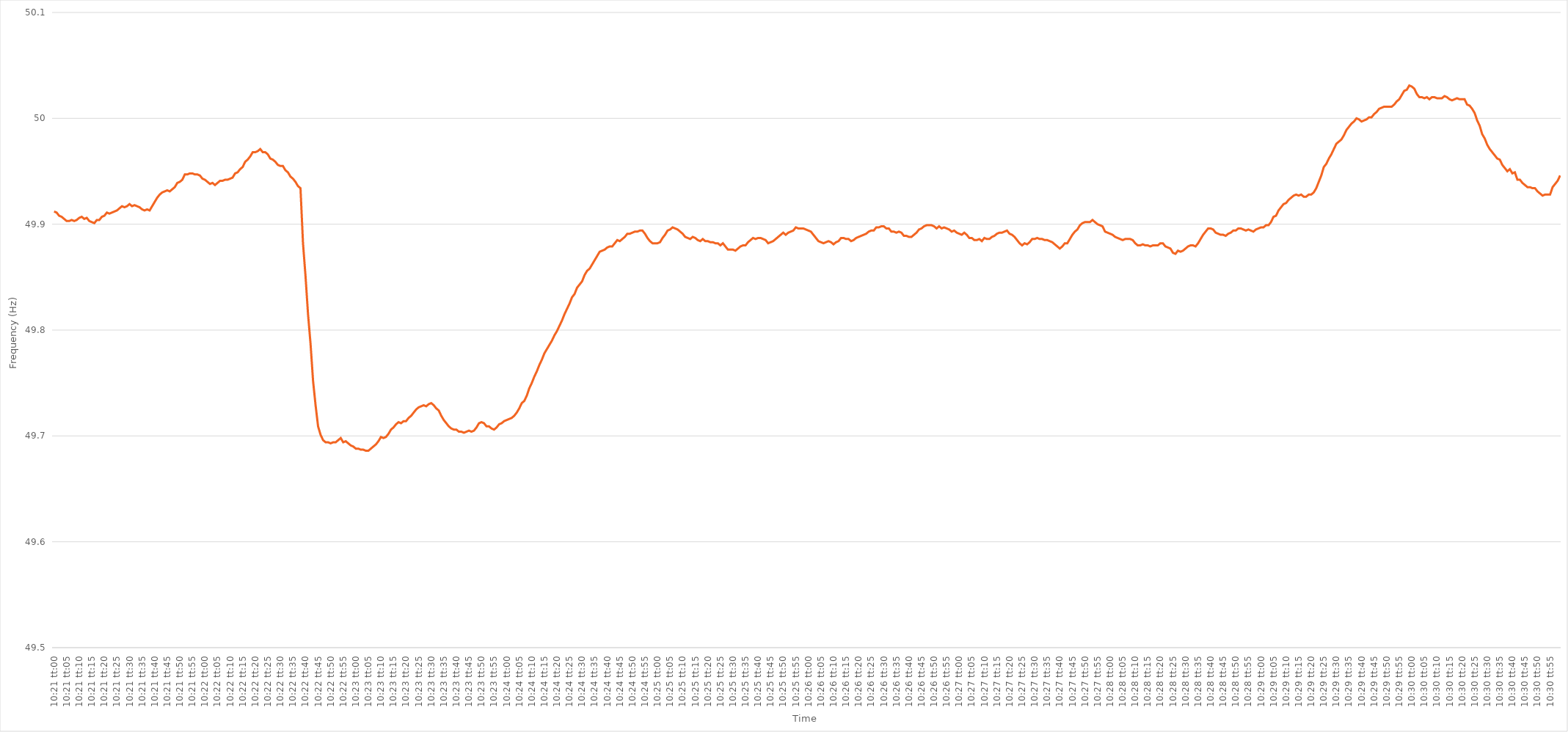
| Category | Series 0 |
|---|---|
| 0.43124999999999997 | 49.912 |
| 0.4312615740740741 | 49.911 |
| 0.43127314814814816 | 49.908 |
| 0.43128472222222225 | 49.907 |
| 0.4312962962962963 | 49.905 |
| 0.4313078703703704 | 49.903 |
| 0.4313194444444444 | 49.903 |
| 0.43133101851851857 | 49.904 |
| 0.4313425925925926 | 49.903 |
| 0.43135416666666665 | 49.904 |
| 0.43136574074074074 | 49.906 |
| 0.4313773148148148 | 49.907 |
| 0.4313888888888889 | 49.905 |
| 0.4314004629629629 | 49.906 |
| 0.43141203703703707 | 49.903 |
| 0.4314236111111111 | 49.902 |
| 0.4314351851851852 | 49.901 |
| 0.43144675925925924 | 49.904 |
| 0.43145833333333333 | 49.904 |
| 0.43146990740740737 | 49.907 |
| 0.4314814814814815 | 49.908 |
| 0.43149305555555556 | 49.911 |
| 0.43150462962962965 | 49.91 |
| 0.4315162037037037 | 49.911 |
| 0.4315277777777778 | 49.912 |
| 0.4315393518518518 | 49.913 |
| 0.431550925925926 | 49.915 |
| 0.4315625 | 49.917 |
| 0.43157407407407405 | 49.916 |
| 0.43158564814814815 | 49.917 |
| 0.4315972222222222 | 49.919 |
| 0.4316087962962963 | 49.917 |
| 0.4316203703703703 | 49.918 |
| 0.43163194444444447 | 49.917 |
| 0.4316435185185185 | 49.916 |
| 0.4316550925925926 | 49.914 |
| 0.43166666666666664 | 49.913 |
| 0.43167824074074074 | 49.914 |
| 0.4316898148148148 | 49.913 |
| 0.4317013888888889 | 49.917 |
| 0.43171296296296297 | 49.921 |
| 0.43172453703703706 | 49.925 |
| 0.4317361111111111 | 49.928 |
| 0.4317476851851852 | 49.93 |
| 0.43175925925925923 | 49.931 |
| 0.4317708333333334 | 49.932 |
| 0.4317824074074074 | 49.931 |
| 0.4317939814814815 | 49.933 |
| 0.43180555555555555 | 49.935 |
| 0.43181712962962965 | 49.939 |
| 0.4318287037037037 | 49.94 |
| 0.4318402777777777 | 49.942 |
| 0.4318518518518519 | 49.947 |
| 0.4318634259259259 | 49.947 |
| 0.431875 | 49.948 |
| 0.43188657407407405 | 49.948 |
| 0.43189814814814814 | 49.947 |
| 0.4319097222222222 | 49.947 |
| 0.43192129629629633 | 49.946 |
| 0.43193287037037037 | 49.943 |
| 0.43194444444444446 | 49.942 |
| 0.4319560185185185 | 49.94 |
| 0.4319675925925926 | 49.938 |
| 0.43197916666666664 | 49.939 |
| 0.4319907407407408 | 49.937 |
| 0.4320023148148148 | 49.939 |
| 0.4320138888888889 | 49.941 |
| 0.43202546296296296 | 49.941 |
| 0.43203703703703705 | 49.942 |
| 0.4320486111111111 | 49.942 |
| 0.43206018518518513 | 49.943 |
| 0.4320717592592593 | 49.944 |
| 0.4320833333333333 | 49.948 |
| 0.4320949074074074 | 49.949 |
| 0.43210648148148145 | 49.952 |
| 0.43211805555555555 | 49.954 |
| 0.4321296296296296 | 49.959 |
| 0.43214120370370374 | 49.961 |
| 0.4321527777777778 | 49.964 |
| 0.43216435185185187 | 49.968 |
| 0.4321759259259259 | 49.968 |
| 0.4321875 | 49.969 |
| 0.43219907407407404 | 49.971 |
| 0.4322106481481482 | 49.968 |
| 0.43222222222222223 | 49.968 |
| 0.4322337962962963 | 49.966 |
| 0.43224537037037036 | 49.962 |
| 0.43225694444444446 | 49.961 |
| 0.4322685185185185 | 49.959 |
| 0.43228009259259265 | 49.956 |
| 0.4322916666666667 | 49.955 |
| 0.4323032407407407 | 49.955 |
| 0.4323148148148148 | 49.951 |
| 0.43232638888888886 | 49.949 |
| 0.43233796296296295 | 49.945 |
| 0.432349537037037 | 49.943 |
| 0.43236111111111114 | 49.94 |
| 0.4323726851851852 | 49.936 |
| 0.4323842592592593 | 49.934 |
| 0.4323958333333333 | 49.882 |
| 0.4324074074074074 | 49.851 |
| 0.43241898148148145 | 49.815 |
| 0.4324305555555556 | 49.787 |
| 0.43244212962962963 | 49.752 |
| 0.43245370370370373 | 49.729 |
| 0.43246527777777777 | 49.709 |
| 0.43247685185185186 | 49.701 |
| 0.4324884259259259 | 49.696 |
| 0.43250000000000005 | 49.694 |
| 0.4325115740740741 | 49.694 |
| 0.4325231481481482 | 49.693 |
| 0.4325347222222222 | 49.694 |
| 0.43254629629629626 | 49.694 |
| 0.43255787037037036 | 49.696 |
| 0.4325694444444444 | 49.698 |
| 0.43258101851851855 | 49.694 |
| 0.4325925925925926 | 49.695 |
| 0.4326041666666667 | 49.693 |
| 0.4326157407407407 | 49.691 |
| 0.4326273148148148 | 49.69 |
| 0.43263888888888885 | 49.688 |
| 0.432650462962963 | 49.688 |
| 0.43266203703703704 | 49.687 |
| 0.43267361111111113 | 49.687 |
| 0.4326851851851852 | 49.686 |
| 0.43269675925925927 | 49.686 |
| 0.4327083333333333 | 49.688 |
| 0.43271990740740746 | 49.69 |
| 0.4327314814814815 | 49.692 |
| 0.4327430555555556 | 49.695 |
| 0.43275462962962963 | 49.699 |
| 0.43276620370370367 | 49.698 |
| 0.43277777777777776 | 49.699 |
| 0.4327893518518518 | 49.702 |
| 0.43280092592592595 | 49.706 |
| 0.4328125 | 49.708 |
| 0.4328240740740741 | 49.711 |
| 0.4328356481481481 | 49.713 |
| 0.4328472222222222 | 49.712 |
| 0.43285879629629626 | 49.714 |
| 0.4328703703703704 | 49.714 |
| 0.43288194444444444 | 49.717 |
| 0.43289351851851854 | 49.719 |
| 0.4329050925925926 | 49.722 |
| 0.43291666666666667 | 49.725 |
| 0.4329282407407407 | 49.727 |
| 0.43293981481481486 | 49.728 |
| 0.4329513888888889 | 49.729 |
| 0.432962962962963 | 49.728 |
| 0.43297453703703703 | 49.73 |
| 0.4329861111111111 | 49.731 |
| 0.43299768518518517 | 49.729 |
| 0.4330092592592593 | 49.726 |
| 0.43302083333333335 | 49.724 |
| 0.4330324074074074 | 49.719 |
| 0.4330439814814815 | 49.715 |
| 0.4330555555555555 | 49.712 |
| 0.4330671296296296 | 49.709 |
| 0.43307870370370366 | 49.707 |
| 0.4330902777777778 | 49.706 |
| 0.43310185185185185 | 49.706 |
| 0.43311342592592594 | 49.704 |
| 0.433125 | 49.704 |
| 0.4331365740740741 | 49.703 |
| 0.4331481481481481 | 49.704 |
| 0.43315972222222227 | 49.705 |
| 0.4331712962962963 | 49.704 |
| 0.4331828703703704 | 49.705 |
| 0.43319444444444444 | 49.708 |
| 0.43320601851851853 | 49.712 |
| 0.43321759259259257 | 49.713 |
| 0.4332291666666667 | 49.712 |
| 0.43324074074074076 | 49.709 |
| 0.4332523148148148 | 49.709 |
| 0.4332638888888889 | 49.707 |
| 0.43327546296296293 | 49.706 |
| 0.433287037037037 | 49.708 |
| 0.43329861111111106 | 49.711 |
| 0.4333101851851852 | 49.712 |
| 0.43332175925925925 | 49.714 |
| 0.43333333333333335 | 49.715 |
| 0.4333449074074074 | 49.716 |
| 0.4333564814814815 | 49.717 |
| 0.4333680555555555 | 49.719 |
| 0.43337962962962967 | 49.722 |
| 0.4333912037037037 | 49.726 |
| 0.4334027777777778 | 49.731 |
| 0.43341435185185184 | 49.733 |
| 0.43342592592592594 | 49.738 |
| 0.4334375 | 49.745 |
| 0.4334490740740741 | 49.75 |
| 0.43346064814814816 | 49.756 |
| 0.4334722222222222 | 49.761 |
| 0.4334837962962963 | 49.767 |
| 0.43349537037037034 | 49.772 |
| 0.43350694444444443 | 49.778 |
| 0.43351851851851847 | 49.782 |
| 0.4335300925925926 | 49.786 |
| 0.43354166666666666 | 49.79 |
| 0.43355324074074075 | 49.795 |
| 0.4335648148148148 | 49.799 |
| 0.4335763888888889 | 49.804 |
| 0.4335879629629629 | 49.809 |
| 0.4335995370370371 | 49.815 |
| 0.4336111111111111 | 49.82 |
| 0.4336226851851852 | 49.825 |
| 0.43363425925925925 | 49.831 |
| 0.43364583333333334 | 49.834 |
| 0.4336574074074074 | 49.84 |
| 0.43366898148148153 | 49.843 |
| 0.43368055555555557 | 49.846 |
| 0.43369212962962966 | 49.852 |
| 0.4337037037037037 | 49.856 |
| 0.4337152777777778 | 49.858 |
| 0.43372685185185184 | 49.862 |
| 0.4337384259259259 | 49.866 |
| 0.43375 | 49.87 |
| 0.43376157407407406 | 49.874 |
| 0.43377314814814816 | 49.875 |
| 0.4337847222222222 | 49.876 |
| 0.4337962962962963 | 49.878 |
| 0.43380787037037033 | 49.879 |
| 0.4338194444444445 | 49.879 |
| 0.4338310185185185 | 49.882 |
| 0.4338425925925926 | 49.885 |
| 0.43385416666666665 | 49.884 |
| 0.43386574074074075 | 49.886 |
| 0.4338773148148148 | 49.888 |
| 0.43388888888888894 | 49.891 |
| 0.433900462962963 | 49.891 |
| 0.43391203703703707 | 49.892 |
| 0.4339236111111111 | 49.893 |
| 0.4339351851851852 | 49.893 |
| 0.43394675925925924 | 49.894 |
| 0.4339583333333333 | 49.894 |
| 0.43396990740740743 | 49.891 |
| 0.43398148148148147 | 49.887 |
| 0.43399305555555556 | 49.884 |
| 0.4340046296296296 | 49.882 |
| 0.4340162037037037 | 49.882 |
| 0.43402777777777773 | 49.882 |
| 0.4340393518518519 | 49.883 |
| 0.4340509259259259 | 49.887 |
| 0.4340625 | 49.89 |
| 0.43407407407407406 | 49.894 |
| 0.43408564814814815 | 49.895 |
| 0.4340972222222222 | 49.897 |
| 0.43410879629629634 | 49.896 |
| 0.4341203703703704 | 49.895 |
| 0.4341319444444445 | 49.893 |
| 0.4341435185185185 | 49.891 |
| 0.4341550925925926 | 49.888 |
| 0.43416666666666665 | 49.887 |
| 0.4341782407407407 | 49.886 |
| 0.43418981481481483 | 49.888 |
| 0.4342013888888889 | 49.887 |
| 0.43421296296296297 | 49.885 |
| 0.434224537037037 | 49.884 |
| 0.4342361111111111 | 49.886 |
| 0.43424768518518514 | 49.884 |
| 0.4342592592592593 | 49.884 |
| 0.43427083333333333 | 49.883 |
| 0.4342824074074074 | 49.883 |
| 0.43429398148148146 | 49.882 |
| 0.43430555555555556 | 49.882 |
| 0.4343171296296296 | 49.88 |
| 0.43432870370370374 | 49.882 |
| 0.4343402777777778 | 49.879 |
| 0.4343518518518519 | 49.876 |
| 0.4343634259259259 | 49.876 |
| 0.434375 | 49.876 |
| 0.43438657407407405 | 49.875 |
| 0.4343981481481482 | 49.877 |
| 0.43440972222222224 | 49.879 |
| 0.43442129629629633 | 49.88 |
| 0.43443287037037037 | 49.88 |
| 0.4344444444444444 | 49.883 |
| 0.4344560185185185 | 49.885 |
| 0.43446759259259254 | 49.887 |
| 0.4344791666666667 | 49.886 |
| 0.43449074074074073 | 49.887 |
| 0.4345023148148148 | 49.887 |
| 0.43451388888888887 | 49.886 |
| 0.43452546296296296 | 49.885 |
| 0.434537037037037 | 49.882 |
| 0.43454861111111115 | 49.883 |
| 0.4345601851851852 | 49.884 |
| 0.4345717592592593 | 49.886 |
| 0.4345833333333333 | 49.888 |
| 0.4345949074074074 | 49.89 |
| 0.43460648148148145 | 49.892 |
| 0.4346180555555556 | 49.89 |
| 0.43462962962962964 | 49.892 |
| 0.43464120370370374 | 49.893 |
| 0.4346527777777778 | 49.894 |
| 0.4346643518518518 | 49.897 |
| 0.4346759259259259 | 49.896 |
| 0.43468749999999995 | 49.896 |
| 0.4346990740740741 | 49.896 |
| 0.43471064814814814 | 49.895 |
| 0.43472222222222223 | 49.894 |
| 0.43473379629629627 | 49.893 |
| 0.43474537037037037 | 49.89 |
| 0.4347569444444444 | 49.887 |
| 0.43476851851851855 | 49.884 |
| 0.4347800925925926 | 49.883 |
| 0.4347916666666667 | 49.882 |
| 0.4348032407407407 | 49.883 |
| 0.4348148148148148 | 49.884 |
| 0.43482638888888886 | 49.883 |
| 0.434837962962963 | 49.881 |
| 0.43484953703703705 | 49.883 |
| 0.43486111111111114 | 49.884 |
| 0.4348726851851852 | 49.887 |
| 0.4348842592592593 | 49.887 |
| 0.4348958333333333 | 49.886 |
| 0.43490740740740735 | 49.886 |
| 0.4349189814814815 | 49.884 |
| 0.43493055555555554 | 49.885 |
| 0.43494212962962964 | 49.887 |
| 0.4349537037037037 | 49.888 |
| 0.43496527777777777 | 49.889 |
| 0.4349768518518518 | 49.89 |
| 0.43498842592592596 | 49.891 |
| 0.435 | 49.893 |
| 0.4350115740740741 | 49.894 |
| 0.43502314814814813 | 49.894 |
| 0.4350347222222222 | 49.897 |
| 0.43504629629629626 | 49.897 |
| 0.4350578703703704 | 49.898 |
| 0.43506944444444445 | 49.898 |
| 0.43508101851851855 | 49.896 |
| 0.4350925925925926 | 49.896 |
| 0.4351041666666667 | 49.893 |
| 0.4351157407407407 | 49.893 |
| 0.43512731481481487 | 49.892 |
| 0.4351388888888889 | 49.893 |
| 0.43515046296296295 | 49.892 |
| 0.43516203703703704 | 49.889 |
| 0.4351736111111111 | 49.889 |
| 0.4351851851851852 | 49.888 |
| 0.4351967592592592 | 49.888 |
| 0.43520833333333336 | 49.89 |
| 0.4352199074074074 | 49.892 |
| 0.4352314814814815 | 49.895 |
| 0.43524305555555554 | 49.896 |
| 0.43525462962962963 | 49.898 |
| 0.43526620370370367 | 49.899 |
| 0.4352777777777778 | 49.899 |
| 0.43528935185185186 | 49.899 |
| 0.43530092592592595 | 49.898 |
| 0.4353125 | 49.896 |
| 0.4353240740740741 | 49.898 |
| 0.4353356481481481 | 49.896 |
| 0.4353472222222223 | 49.897 |
| 0.4353587962962963 | 49.896 |
| 0.43537037037037035 | 49.895 |
| 0.43538194444444445 | 49.893 |
| 0.4353935185185185 | 49.894 |
| 0.4354050925925926 | 49.892 |
| 0.4354166666666666 | 49.891 |
| 0.43542824074074077 | 49.89 |
| 0.4354398148148148 | 49.892 |
| 0.4354513888888889 | 49.89 |
| 0.43546296296296294 | 49.887 |
| 0.43547453703703703 | 49.887 |
| 0.4354861111111111 | 49.885 |
| 0.4354976851851852 | 49.885 |
| 0.43550925925925926 | 49.886 |
| 0.43552083333333336 | 49.884 |
| 0.4355324074074074 | 49.887 |
| 0.4355439814814815 | 49.886 |
| 0.43555555555555553 | 49.886 |
| 0.4355671296296297 | 49.888 |
| 0.4355787037037037 | 49.889 |
| 0.4355902777777778 | 49.891 |
| 0.43560185185185185 | 49.892 |
| 0.43561342592592595 | 49.892 |
| 0.435625 | 49.893 |
| 0.435636574074074 | 49.894 |
| 0.4356481481481482 | 49.891 |
| 0.4356597222222222 | 49.89 |
| 0.4356712962962963 | 49.888 |
| 0.43568287037037035 | 49.885 |
| 0.43569444444444444 | 49.882 |
| 0.4357060185185185 | 49.88 |
| 0.43571759259259263 | 49.882 |
| 0.43572916666666667 | 49.881 |
| 0.43574074074074076 | 49.883 |
| 0.4357523148148148 | 49.886 |
| 0.4357638888888889 | 49.886 |
| 0.43577546296296293 | 49.887 |
| 0.4357870370370371 | 49.886 |
| 0.4357986111111111 | 49.886 |
| 0.4358101851851852 | 49.885 |
| 0.43582175925925926 | 49.885 |
| 0.43583333333333335 | 49.884 |
| 0.4358449074074074 | 49.883 |
| 0.43585648148148143 | 49.881 |
| 0.4358680555555556 | 49.879 |
| 0.4358796296296296 | 49.877 |
| 0.4358912037037037 | 49.879 |
| 0.43590277777777775 | 49.882 |
| 0.43591435185185184 | 49.882 |
| 0.4359259259259259 | 49.886 |
| 0.43593750000000003 | 49.89 |
| 0.43594907407407407 | 49.893 |
| 0.43596064814814817 | 49.895 |
| 0.4359722222222222 | 49.899 |
| 0.4359837962962963 | 49.901 |
| 0.43599537037037034 | 49.902 |
| 0.4360069444444445 | 49.902 |
| 0.4360185185185185 | 49.902 |
| 0.4360300925925926 | 49.904 |
| 0.43604166666666666 | 49.902 |
| 0.43605324074074076 | 49.9 |
| 0.4360648148148148 | 49.899 |
| 0.43607638888888883 | 49.898 |
| 0.436087962962963 | 49.893 |
| 0.436099537037037 | 49.892 |
| 0.4361111111111111 | 49.891 |
| 0.43612268518518515 | 49.89 |
| 0.43613425925925925 | 49.888 |
| 0.4361458333333333 | 49.887 |
| 0.43615740740740744 | 49.886 |
| 0.4361689814814815 | 49.885 |
| 0.43618055555555557 | 49.886 |
| 0.4361921296296296 | 49.886 |
| 0.4362037037037037 | 49.886 |
| 0.43621527777777774 | 49.885 |
| 0.4362268518518519 | 49.882 |
| 0.43623842592592593 | 49.88 |
| 0.43625 | 49.88 |
| 0.43626157407407407 | 49.881 |
| 0.43627314814814816 | 49.88 |
| 0.4362847222222222 | 49.88 |
| 0.43629629629629635 | 49.879 |
| 0.4363078703703704 | 49.88 |
| 0.4363194444444445 | 49.88 |
| 0.4363310185185185 | 49.88 |
| 0.43634259259259256 | 49.882 |
| 0.43635416666666665 | 49.882 |
| 0.4363657407407407 | 49.879 |
| 0.43637731481481484 | 49.878 |
| 0.4363888888888889 | 49.877 |
| 0.436400462962963 | 49.873 |
| 0.436412037037037 | 49.872 |
| 0.4364236111111111 | 49.875 |
| 0.43643518518518515 | 49.874 |
| 0.4364467592592593 | 49.875 |
| 0.43645833333333334 | 49.877 |
| 0.43646990740740743 | 49.879 |
| 0.43648148148148147 | 49.88 |
| 0.43649305555555556 | 49.88 |
| 0.4365046296296296 | 49.879 |
| 0.43651620370370375 | 49.882 |
| 0.4365277777777778 | 49.886 |
| 0.4365393518518519 | 49.89 |
| 0.4365509259259259 | 49.893 |
| 0.43656249999999996 | 49.896 |
| 0.43657407407407406 | 49.896 |
| 0.4365856481481481 | 49.895 |
| 0.43659722222222225 | 49.892 |
| 0.4366087962962963 | 49.891 |
| 0.4366203703703704 | 49.89 |
| 0.4366319444444444 | 49.89 |
| 0.4366435185185185 | 49.889 |
| 0.43665509259259255 | 49.891 |
| 0.4366666666666667 | 49.892 |
| 0.43667824074074074 | 49.894 |
| 0.43668981481481484 | 49.894 |
| 0.4367013888888889 | 49.896 |
| 0.43671296296296297 | 49.896 |
| 0.436724537037037 | 49.895 |
| 0.43673611111111116 | 49.894 |
| 0.4367476851851852 | 49.895 |
| 0.4367592592592593 | 49.894 |
| 0.43677083333333333 | 49.893 |
| 0.43678240740740737 | 49.895 |
| 0.43679398148148146 | 49.896 |
| 0.4368055555555555 | 49.897 |
| 0.43681712962962965 | 49.897 |
| 0.4368287037037037 | 49.899 |
| 0.4368402777777778 | 49.899 |
| 0.4368518518518518 | 49.902 |
| 0.4368634259259259 | 49.907 |
| 0.43687499999999996 | 49.908 |
| 0.4368865740740741 | 49.913 |
| 0.43689814814814815 | 49.916 |
| 0.43690972222222224 | 49.919 |
| 0.4369212962962963 | 49.92 |
| 0.4369328703703704 | 49.923 |
| 0.4369444444444444 | 49.925 |
| 0.43695601851851856 | 49.927 |
| 0.4369675925925926 | 49.928 |
| 0.4369791666666667 | 49.927 |
| 0.43699074074074074 | 49.928 |
| 0.43700231481481483 | 49.926 |
| 0.43701388888888887 | 49.926 |
| 0.437025462962963 | 49.928 |
| 0.43703703703703706 | 49.928 |
| 0.4370486111111111 | 49.93 |
| 0.4370601851851852 | 49.934 |
| 0.43707175925925923 | 49.94 |
| 0.4370833333333333 | 49.946 |
| 0.43709490740740736 | 49.954 |
| 0.4371064814814815 | 49.957 |
| 0.43711805555555555 | 49.962 |
| 0.43712962962962965 | 49.966 |
| 0.4371412037037037 | 49.971 |
| 0.4371527777777778 | 49.976 |
| 0.4371643518518518 | 49.978 |
| 0.43717592592592597 | 49.98 |
| 0.4371875 | 49.984 |
| 0.4371990740740741 | 49.989 |
| 0.43721064814814814 | 49.992 |
| 0.43722222222222223 | 49.995 |
| 0.4372337962962963 | 49.997 |
| 0.4372453703703704 | 50 |
| 0.43725694444444446 | 49.999 |
| 0.4372685185185185 | 49.997 |
| 0.4372800925925926 | 49.998 |
| 0.43729166666666663 | 49.999 |
| 0.43730324074074073 | 50.001 |
| 0.43731481481481477 | 50.001 |
| 0.4373263888888889 | 50.004 |
| 0.43733796296296296 | 50.006 |
| 0.43734953703703705 | 50.009 |
| 0.4373611111111111 | 50.01 |
| 0.4373726851851852 | 50.011 |
| 0.4373842592592592 | 50.011 |
| 0.4373958333333334 | 50.011 |
| 0.4374074074074074 | 50.011 |
| 0.4374189814814815 | 50.013 |
| 0.43743055555555554 | 50.016 |
| 0.43744212962962964 | 50.018 |
| 0.4374537037037037 | 50.022 |
| 0.43746527777777783 | 50.026 |
| 0.43747685185185187 | 50.027 |
| 0.43748842592592596 | 50.031 |
| 0.4375 | 50.03 |
| 0.43751157407407404 | 50.028 |
| 0.43752314814814813 | 50.023 |
| 0.43753472222222217 | 50.02 |
| 0.4375462962962963 | 50.02 |
| 0.43755787037037036 | 50.019 |
| 0.43756944444444446 | 50.02 |
| 0.4375810185185185 | 50.018 |
| 0.4375925925925926 | 50.02 |
| 0.4376041666666666 | 50.02 |
| 0.4376157407407408 | 50.019 |
| 0.4376273148148148 | 50.019 |
| 0.4376388888888889 | 50.019 |
| 0.43765046296296295 | 50.021 |
| 0.43766203703703704 | 50.02 |
| 0.4376736111111111 | 50.018 |
| 0.43768518518518523 | 50.017 |
| 0.43769675925925927 | 50.018 |
| 0.43770833333333337 | 50.019 |
| 0.4377199074074074 | 50.018 |
| 0.4377314814814815 | 50.018 |
| 0.43774305555555554 | 50.018 |
| 0.4377546296296296 | 50.013 |
| 0.4377662037037037 | 50.012 |
| 0.43777777777777777 | 50.009 |
| 0.43778935185185186 | 50.005 |
| 0.4378009259259259 | 49.998 |
| 0.4378125 | 49.993 |
| 0.43782407407407403 | 49.985 |
| 0.4378356481481482 | 49.981 |
| 0.4378472222222222 | 49.975 |
| 0.4378587962962963 | 49.971 |
| 0.43787037037037035 | 49.968 |
| 0.43788194444444445 | 49.965 |
| 0.4378935185185185 | 49.962 |
| 0.43790509259259264 | 49.961 |
| 0.4379166666666667 | 49.956 |
| 0.43792824074074077 | 49.953 |
| 0.4379398148148148 | 49.95 |
| 0.4379513888888889 | 49.952 |
| 0.43796296296296294 | 49.948 |
| 0.437974537037037 | 49.949 |
| 0.43798611111111113 | 49.942 |
| 0.43799768518518517 | 49.942 |
| 0.43800925925925926 | 49.939 |
| 0.4380208333333333 | 49.937 |
| 0.4380324074074074 | 49.935 |
| 0.43804398148148144 | 49.935 |
| 0.4380555555555556 | 49.934 |
| 0.4380671296296296 | 49.934 |
| 0.4380787037037037 | 49.931 |
| 0.43809027777777776 | 49.929 |
| 0.43810185185185185 | 49.927 |
| 0.4381134259259259 | 49.928 |
| 0.43812500000000004 | 49.928 |
| 0.4381365740740741 | 49.928 |
| 0.4381481481481482 | 49.935 |
| 0.4381597222222222 | 49.938 |
| 0.4381712962962963 | 49.941 |
| 0.43818287037037035 | 49.946 |